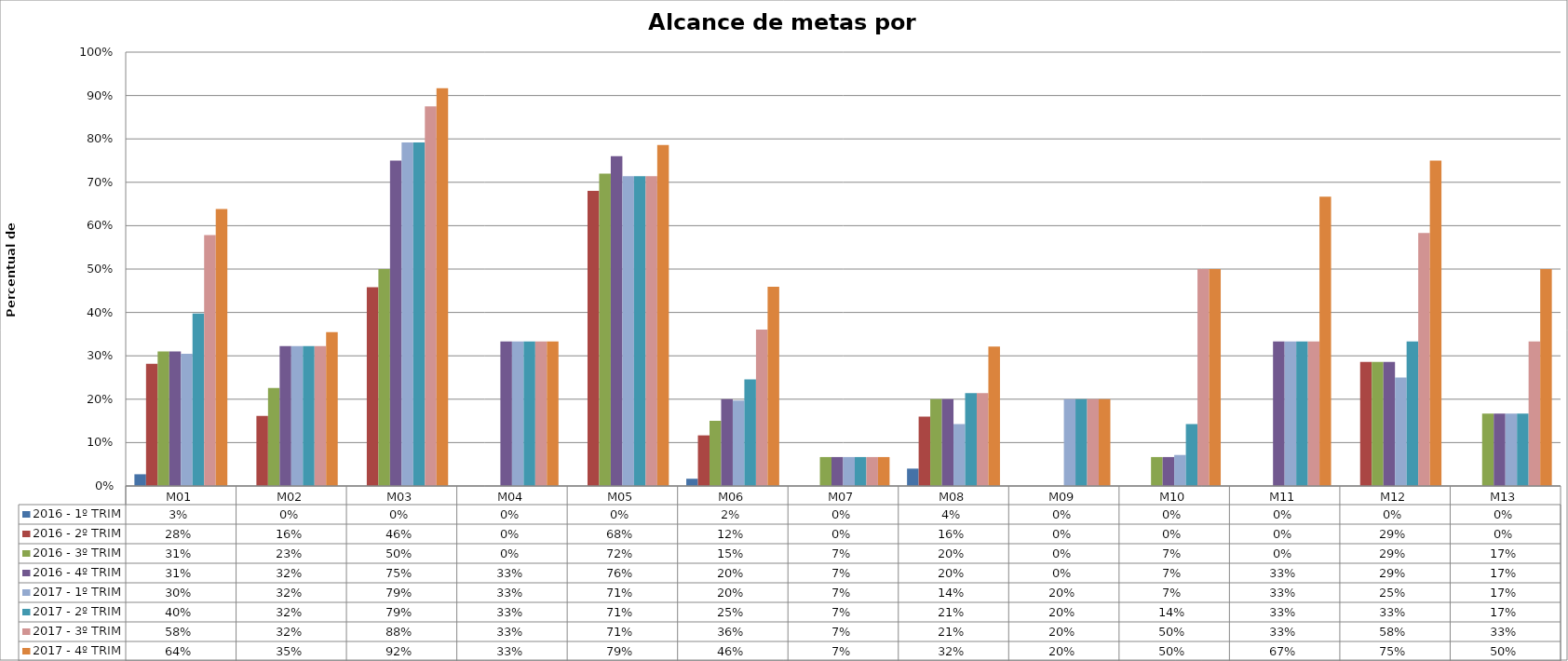
| Category | 2016 - 1º TRIM | 2016 - 2º TRIM | 2016 - 3º TRIM | 2016 - 4º TRIM | 2017 - 1º TRIM | 2017 - 2º TRIM | 2017 - 3º TRIM | 2017 - 4º TRIM |
|---|---|---|---|---|---|---|---|---|
| M01 | 0.027 | 0.282 | 0.31 | 0.31 | 0.305 | 0.398 | 0.578 | 0.639 |
| M02 | 0 | 0.161 | 0.226 | 0.323 | 0.323 | 0.323 | 0.323 | 0.355 |
| M03 | 0 | 0.458 | 0.5 | 0.75 | 0.792 | 0.792 | 0.875 | 0.917 |
| M04 | 0 | 0 | 0 | 0.333 | 0.333 | 0.333 | 0.333 | 0.333 |
| M05 | 0 | 0.68 | 0.72 | 0.76 | 0.714 | 0.714 | 0.714 | 0.786 |
| M06 | 0.017 | 0.117 | 0.15 | 0.2 | 0.197 | 0.246 | 0.361 | 0.459 |
| M07 | 0 | 0 | 0.067 | 0.067 | 0.067 | 0.067 | 0.067 | 0.067 |
| M08 | 0.04 | 0.16 | 0.2 | 0.2 | 0.143 | 0.214 | 0.214 | 0.321 |
| M09 | 0 | 0 | 0 | 0 | 0.2 | 0.2 | 0.2 | 0.2 |
| M10 | 0 | 0 | 0.067 | 0.067 | 0.071 | 0.143 | 0.5 | 0.5 |
| M11 | 0 | 0 | 0 | 0.333 | 0.333 | 0.333 | 0.333 | 0.667 |
| M12 | 0 | 0.286 | 0.286 | 0.286 | 0.25 | 0.333 | 0.583 | 0.75 |
| M13 | 0 | 0 | 0.167 | 0.167 | 0.167 | 0.167 | 0.333 | 0.5 |